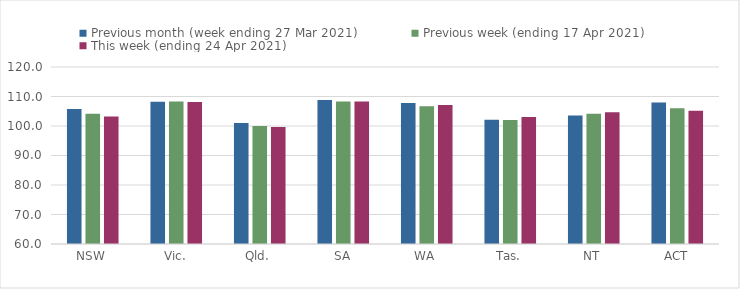
| Category | Previous month (week ending 27 Mar 2021) | Previous week (ending 17 Apr 2021) | This week (ending 24 Apr 2021) |
|---|---|---|---|
| NSW | 105.73 | 104.15 | 103.26 |
| Vic. | 108.22 | 108.3 | 108.1 |
| Qld. | 101.04 | 99.99 | 99.68 |
| SA | 108.81 | 108.3 | 108.29 |
| WA | 107.81 | 106.69 | 107.14 |
| Tas. | 102.09 | 102 | 103.03 |
| NT | 103.54 | 104.13 | 104.7 |
| ACT | 108 | 106.04 | 105.16 |